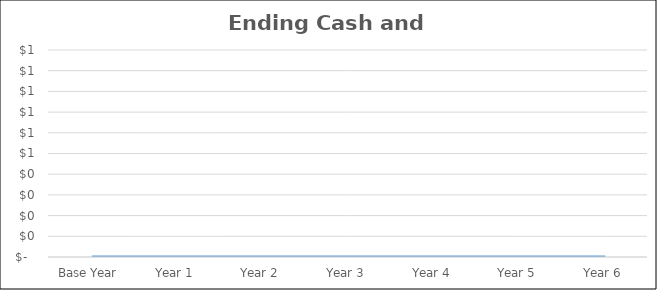
| Category | Ending Cash and Investments |
|---|---|
| Base Year | 0 |
| Year 1 | 0 |
| Year 2 | 0 |
| Year 3 | 0 |
| Year 4 | 0 |
| Year 5 | 0 |
| Year 6 | 0 |